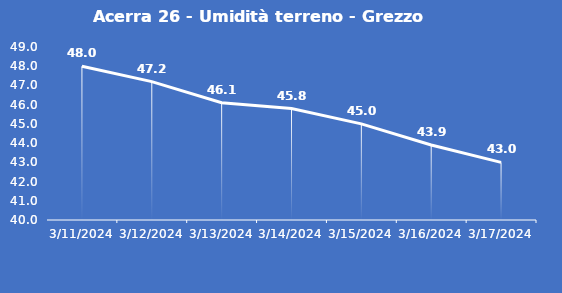
| Category | Acerra 26 - Umidità terreno - Grezzo (%VWC) |
|---|---|
| 3/11/24 | 48 |
| 3/12/24 | 47.2 |
| 3/13/24 | 46.1 |
| 3/14/24 | 45.8 |
| 3/15/24 | 45 |
| 3/16/24 | 43.9 |
| 3/17/24 | 43 |